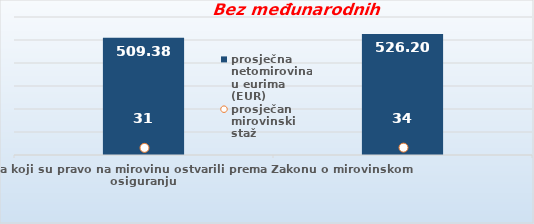
| Category | prosječna netomirovina u eurima (EUR) |
|---|---|
| Korisnici mirovina koji su pravo na mirovinu ostvarili prema Zakonu o mirovinskom osiguranju  | 509.38 |
| Korisnici koji su pravo na mirovinu PRVI PUT ostvarili u 2023. godini prema Zakonu o mirovinskom osiguranju - NOVI KORISNICI | 526.202 |